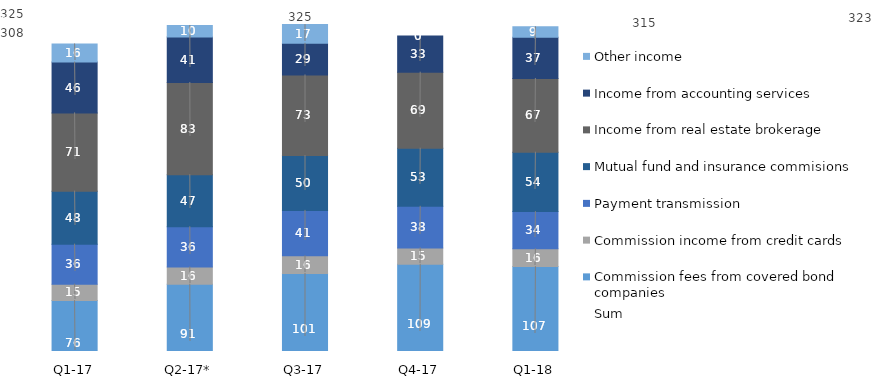
| Category | Commission fees from covered bond companies | Commission income from credit cards | Payment transmission | Mutual fund and insurance commisions | Income from real estate brokerage | Income from accounting services | Other income |
|---|---|---|---|---|---|---|---|
| Q1-18 | 106.7 | 16.1 | 33.6 | 53.7 | 66.6 | 37.3 | 9.4 |
| Q4-17 | 108.8 | 14.8 | 37.6 | 52.5 | 68.7 | 32.7 | 0 |
| Q3-17 | 100.5 | 16 | 41 | 49.5 | 72.9 | 28.6 | 16.9 |
| Q2-17* | 90.8 | 15.5 | 36.4 | 47.1 | 83.3 | 41.1 | 10.4 |
| Q1-17 | 76 | 14.8 | 36.2 | 47.9 | 70.7 | 45.9 | 16.4 |